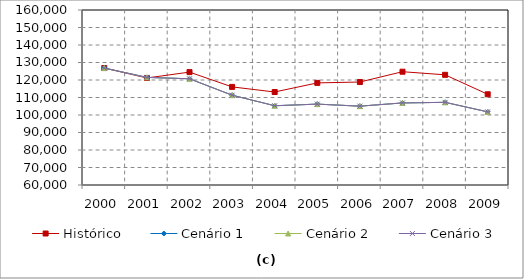
| Category | Histórico | Cenário 1 | Cenário 2 | Cenário 3 |
|---|---|---|---|---|
| 2000.0 | 126826 | 126826 | 126826 | 126826 |
| 2001.0 | 121164.475 | 121490.136 | 121490.136 | 121490.136 |
| 2002.0 | 124508.167 | 120702.779 | 120702.779 | 120702.779 |
| 2003.0 | 116058.758 | 111319.797 | 111319.797 | 111319.797 |
| 2004.0 | 113142.952 | 105291.768 | 105291.768 | 105291.768 |
| 2005.0 | 118345.343 | 106214.53 | 106214.53 | 106214.53 |
| 2006.0 | 118847.144 | 105045.392 | 105045.392 | 105045.392 |
| 2007.0 | 124736.07 | 106901.556 | 106901.556 | 106901.556 |
| 2008.0 | 122958.467 | 107238.386 | 107238.386 | 107238.386 |
| 2009.0 | 111846.038 | 101792.247 | 101792.247 | 101792.247 |